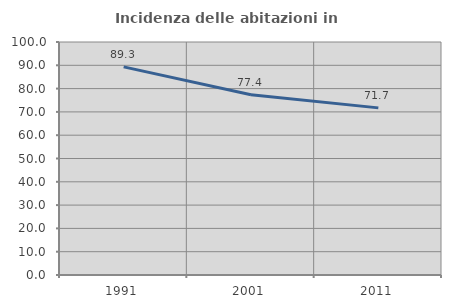
| Category | Incidenza delle abitazioni in proprietà  |
|---|---|
| 1991.0 | 89.313 |
| 2001.0 | 77.358 |
| 2011.0 | 71.724 |